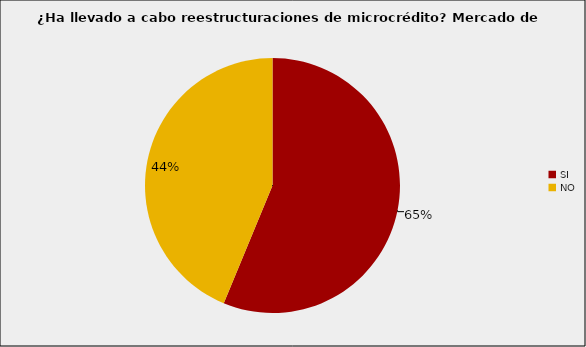
| Category | Mercado de Microcrédito |
|---|---|
| SI | 0.563 |
| NO | 0.438 |